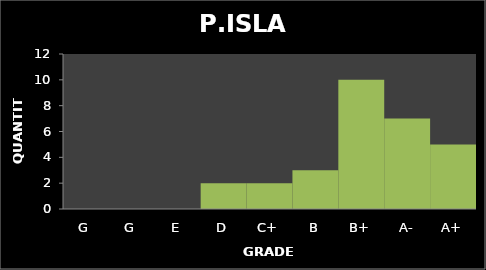
| Category | Quantity |
|---|---|
| G | 0 |
| G | 0 |
| E | 0 |
| D | 2 |
| C+ | 2 |
| B | 3 |
| B+ | 10 |
| A- | 7 |
| A+ | 5 |